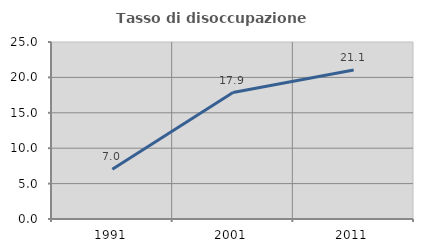
| Category | Tasso di disoccupazione giovanile  |
|---|---|
| 1991.0 | 7.018 |
| 2001.0 | 17.857 |
| 2011.0 | 21.053 |